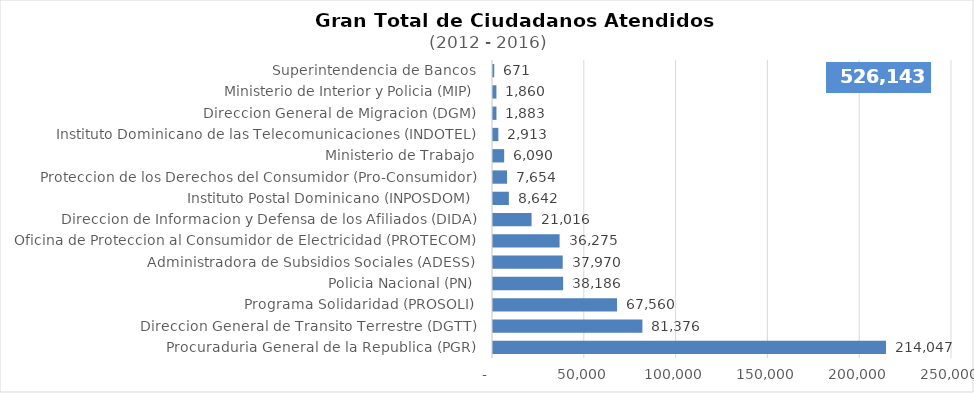
| Category | Series 0 |
|---|---|
| Procuraduria General de la Republica (PGR) | 214047 |
| Direccion General de Transito Terrestre (DGTT) | 81376 |
| Programa Solidaridad (PROSOLI) | 67560 |
| Policia Nacional (PN) | 38186 |
| Administradora de Subsidios Sociales (ADESS) | 37970 |
| Oficina de Proteccion al Consumidor de Electricidad (PROTECOM) | 36275 |
| Direccion de Informacion y Defensa de los Afiliados (DIDA) | 21016 |
| Instituto Postal Dominicano (INPOSDOM) | 8642 |
| Proteccion de los Derechos del Consumidor (Pro-Consumidor) | 7654 |
| Ministerio de Trabajo | 6090 |
| Instituto Dominicano de las Telecomunicaciones (INDOTEL) | 2913 |
| Direccion General de Migracion (DGM) | 1883 |
| Ministerio de Interior y Policia (MIP) | 1860 |
| Superintendencia de Bancos | 671 |